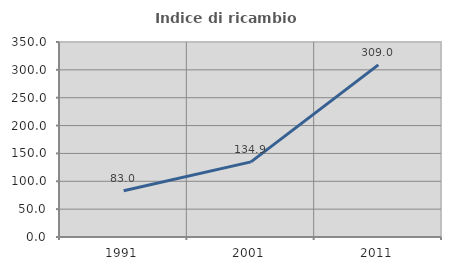
| Category | Indice di ricambio occupazionale  |
|---|---|
| 1991.0 | 83.008 |
| 2001.0 | 134.853 |
| 2011.0 | 308.977 |